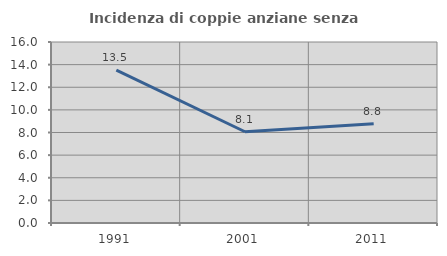
| Category | Incidenza di coppie anziane senza figli  |
|---|---|
| 1991.0 | 13.514 |
| 2001.0 | 8.065 |
| 2011.0 | 8.772 |